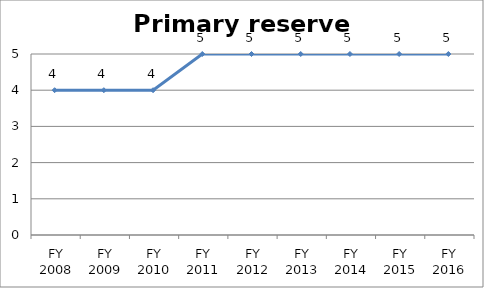
| Category | Primary reserve score |
|---|---|
| FY 2016 | 5 |
| FY 2015 | 5 |
| FY 2014 | 5 |
| FY 2013 | 5 |
| FY 2012 | 5 |
| FY 2011 | 5 |
| FY 2010 | 4 |
| FY 2009 | 4 |
| FY 2008 | 4 |